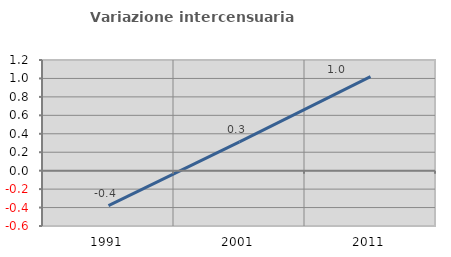
| Category | Variazione intercensuaria annua |
|---|---|
| 1991.0 | -0.38 |
| 2001.0 | 0.313 |
| 2011.0 | 1.02 |